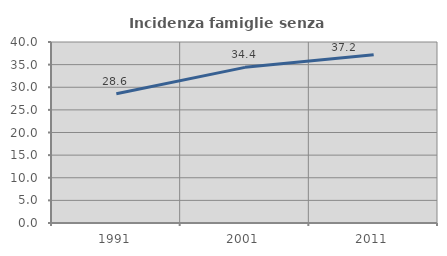
| Category | Incidenza famiglie senza nuclei |
|---|---|
| 1991.0 | 28.556 |
| 2001.0 | 34.395 |
| 2011.0 | 37.203 |